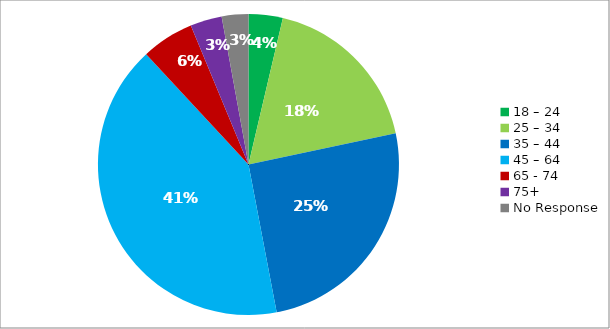
| Category | Responses |
|---|---|
| 18 – 24 | 0.037 |
| 25 – 34 | 0.18 |
| 35 – 44 | 0.253 |
| 45 – 64 | 0.411 |
| 65 - 74 | 0.056 |
| 75+ | 0.034 |
| No Response | 0.029 |